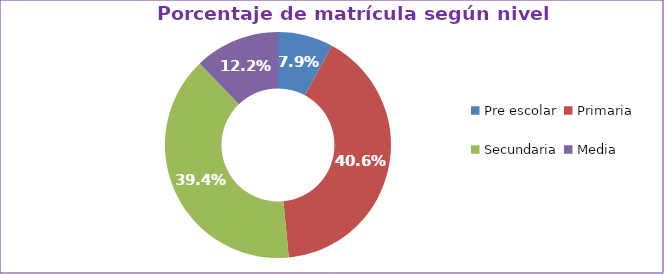
| Category | Series 0 |
|---|---|
| Pre escolar | 0.079 |
| Primaria | 0.406 |
| Secundaria | 0.394 |
| Media | 0.122 |